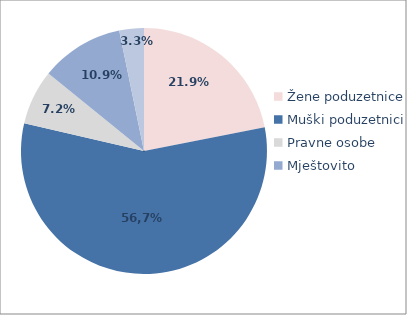
| Category | Series 0 |
|---|---|
| Žene poduzetnice  | 21.923 |
| Muški poduzetnici | 56.712 |
| Pravne osobe | 7.214 |
| Mještovito | 10.919 |
| Neodređeno | 3.232 |